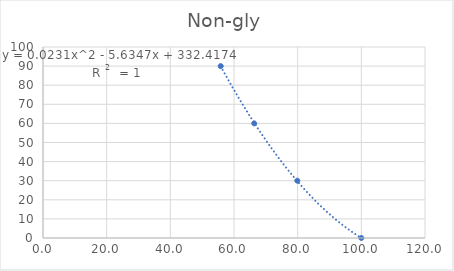
| Category | Time (minutes) |
|---|---|
| 100.0 | 0 |
| 79.87603250000001 | 30 |
| 66.34923500000001 | 60 |
| 55.82691749999999 | 90 |